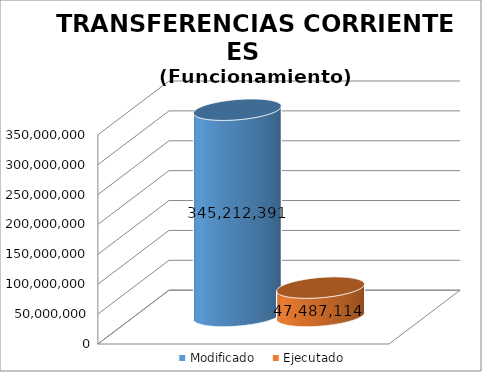
| Category | Modificado | Ejecutado |
|---|---|---|
| 0 | 345212391 | 47487114.29 |